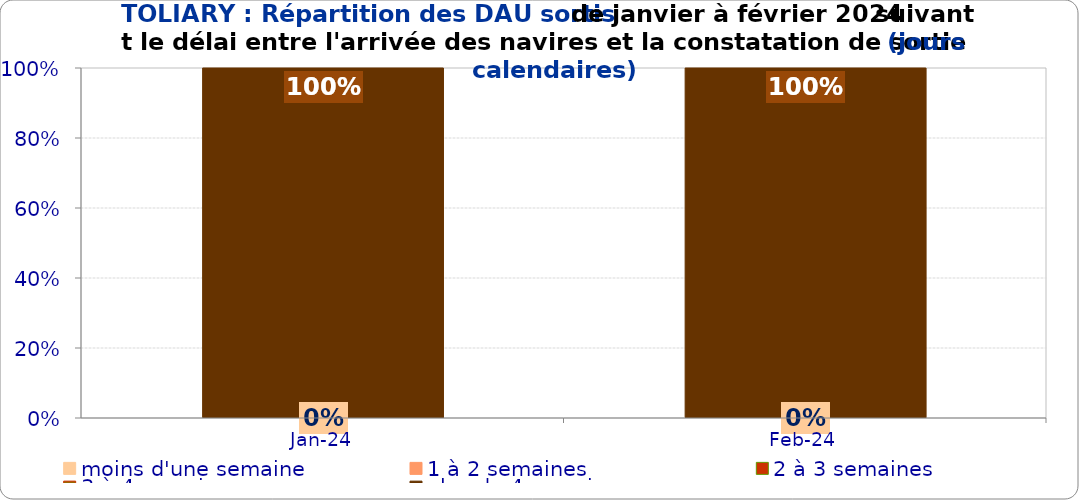
| Category | moins d'une semaine | 1 à 2 semaines | 2 à 3 semaines | 3 à 4 semaines | plus de 4 semaines |
|---|---|---|---|---|---|
| 2024-01-01 | 0 | 0 | 0 | 0 | 1 |
| 2024-02-01 | 0 | 0 | 0 | 0 | 1 |